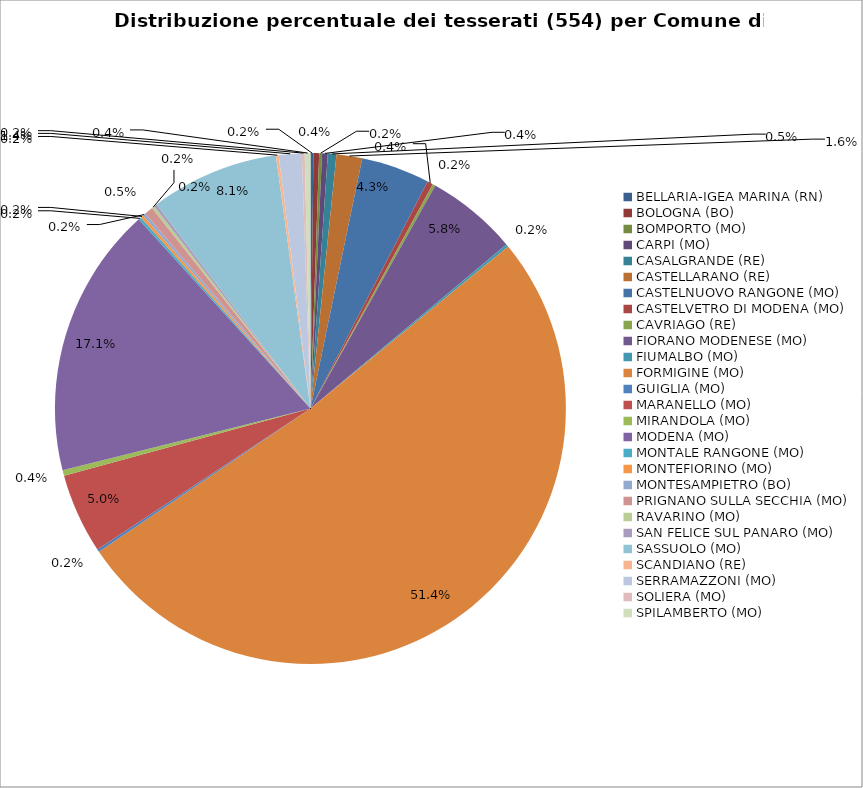
| Category | Nr. Tesserati |
|---|---|
| BELLARIA-IGEA MARINA (RN) | 1 |
| BOLOGNA (BO) | 2 |
| BOMPORTO (MO) | 1 |
| CARPI (MO) | 2 |
| CASALGRANDE (RE) | 3 |
| CASTELLARANO (RE) | 9 |
| CASTELNUOVO RANGONE (MO) | 24 |
| CASTELVETRO DI MODENA (MO) | 2 |
| CAVRIAGO (RE) | 1 |
| FIORANO MODENESE (MO) | 32 |
| FIUMALBO (MO) | 1 |
| FORMIGINE (MO) | 285 |
| GUIGLIA (MO) | 1 |
| MARANELLO (MO) | 28 |
| MIRANDOLA (MO) | 2 |
| MODENA (MO) | 95 |
| MONTALE RANGONE (MO) | 1 |
| MONTEFIORINO (MO) | 1 |
| MONTESAMPIETRO (BO) | 1 |
| PRIGNANO SULLA SECCHIA (MO) | 3 |
| RAVARINO (MO) | 1 |
| SAN FELICE SUL PANARO (MO) | 1 |
| SASSUOLO (MO) | 45 |
| SCANDIANO (RE) | 1 |
| SERRAMAZZONI (MO) | 8 |
| SOLIERA (MO) | 1 |
| SPILAMBERTO (MO) | 2 |